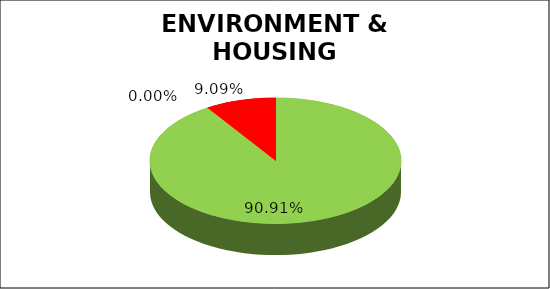
| Category | Q4 |
|---|---|
| Green | 0.909 |
| Amber | 0 |
| Red | 0.091 |